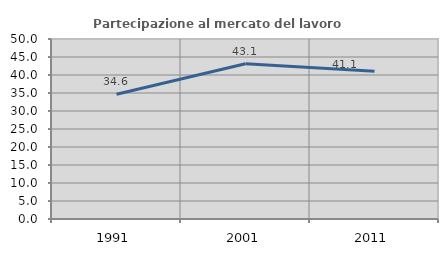
| Category | Partecipazione al mercato del lavoro  femminile |
|---|---|
| 1991.0 | 34.649 |
| 2001.0 | 43.119 |
| 2011.0 | 41.053 |